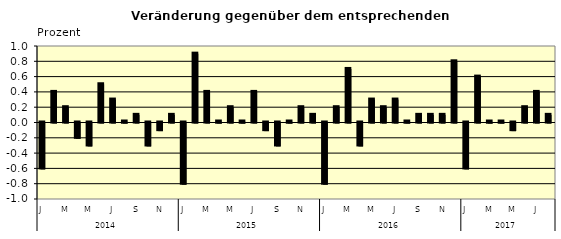
| Category | Series 0 |
|---|---|
| 0 | -0.6 |
| 1 | 0.4 |
| 2 | 0.2 |
| 3 | -0.2 |
| 4 | -0.3 |
| 5 | 0.5 |
| 6 | 0.3 |
| 7 | 0.01 |
| 8 | 0.1 |
| 9 | -0.3 |
| 10 | -0.1 |
| 11 | 0.1 |
| 12 | -0.8 |
| 13 | 0.9 |
| 14 | 0.4 |
| 15 | 0.01 |
| 16 | 0.2 |
| 17 | 0.01 |
| 18 | 0.4 |
| 19 | -0.1 |
| 20 | -0.3 |
| 21 | 0.01 |
| 22 | 0.2 |
| 23 | 0.1 |
| 24 | -0.8 |
| 25 | 0.2 |
| 26 | 0.7 |
| 27 | -0.3 |
| 28 | 0.3 |
| 29 | 0.2 |
| 30 | 0.3 |
| 31 | 0.01 |
| 32 | 0.1 |
| 33 | 0.1 |
| 34 | 0.1 |
| 35 | 0.8 |
| 36 | -0.6 |
| 37 | 0.6 |
| 38 | 0.01 |
| 39 | 0.01 |
| 40 | -0.1 |
| 41 | 0.2 |
| 42 | 0.4 |
| 43 | 0.1 |